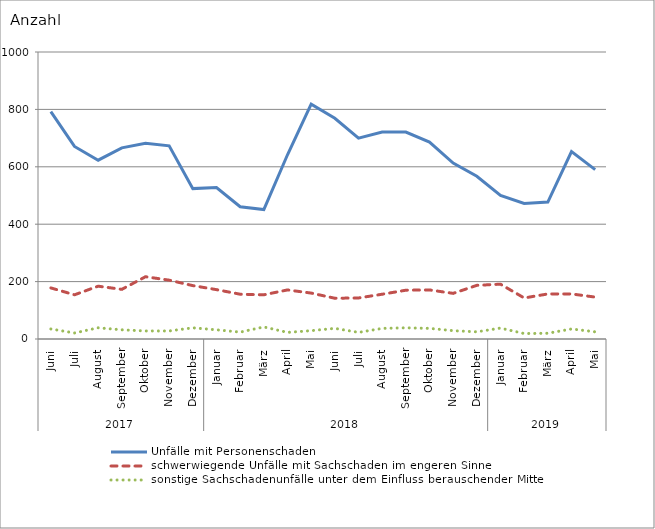
| Category | Unfälle mit Personenschaden | schwerwiegende Unfälle mit Sachschaden im engeren Sinne | sonstige Sachschadenunfälle unter dem Einfluss berauschender Mittel |
|---|---|---|---|
| 0 | 792 | 178 | 35 |
| 1 | 671 | 154 | 21 |
| 2 | 623 | 184 | 39 |
| 3 | 666 | 173 | 32 |
| 4 | 682 | 217 | 28 |
| 5 | 673 | 205 | 28 |
| 6 | 524 | 186 | 39 |
| 7 | 528 | 172 | 32 |
| 8 | 461 | 156 | 24 |
| 9 | 451 | 154 | 42 |
| 10 | 642 | 171 | 23 |
| 11 | 818 | 160 | 29 |
| 12 | 769 | 142 | 37 |
| 13 | 700 | 143 | 23 |
| 14 | 721 | 156 | 37 |
| 15 | 721 | 170 | 39 |
| 16 | 686 | 171 | 37 |
| 17 | 613 | 159 | 29 |
| 18 | 567 | 187 | 25 |
| 19 | 500 | 191 | 38 |
| 20 | 472 | 143 | 19 |
| 21 | 477 | 157 | 20 |
| 22 | 653 | 157 | 35 |
| 23 | 590 | 146 | 25 |